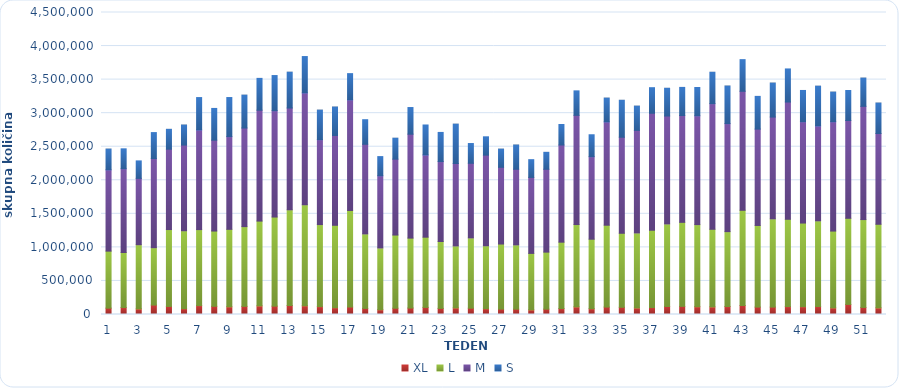
| Category | XL | L | M | S |
|---|---|---|---|---|
| 0 | 94498 | 849678 | 1211338 | 309528 |
| 1 | 103818 | 820427 | 1247774 | 296675 |
| 2 | 83492 | 956067 | 988707 | 260544 |
| 3 | 140397 | 855020 | 1328131 | 387200 |
| 4 | 120017 | 1145674 | 1197704 | 295847 |
| 5 | 87150 | 1160409 | 1276869 | 298854 |
| 6 | 132962 | 1131885 | 1485247 | 482327 |
| 7 | 121484 | 1122017 | 1353790 | 473146 |
| 8 | 114887 | 1154197 | 1381401 | 582470 |
| 9 | 120963 | 1188144 | 1469323 | 490367 |
| 10 | 128666 | 1263235 | 1652187 | 474093 |
| 11 | 124166 | 1328130 | 1584402 | 523873 |
| 12 | 134359 | 1425244 | 1516901 | 534403 |
| 13 | 129889 | 1504830 | 1667198 | 541641 |
| 14 | 117575 | 1222252 | 1265133 | 440721 |
| 15 | 101484 | 1227779 | 1338692 | 423594 |
| 16 | 111031 | 1439070 | 1648310 | 390646 |
| 17 | 90966 | 1109527 | 1336004 | 366061 |
| 18 | 71180 | 920005 | 1076216 | 285326 |
| 19 | 93447 | 1090432 | 1130594 | 312528 |
| 20 | 96065 | 1042082 | 1548541 | 397261 |
| 21 | 105811 | 1046149 | 1225162 | 446762 |
| 22 | 90800 | 996980 | 1190974 | 434161 |
| 23 | 98736 | 922563 | 1228394 | 586894 |
| 24 | 93793 | 1047279 | 1112355 | 294161 |
| 25 | 86603 | 937263 | 1350661 | 273278 |
| 26 | 80118 | 969922 | 1143302 | 271268 |
| 27 | 79741 | 957360 | 1126992 | 361473 |
| 28 | 69391 | 841086 | 1132247 | 264313 |
| 29 | 79714 | 849701 | 1234602 | 252455 |
| 30 | 88506 | 989214 | 1447853 | 305524 |
| 31 | 113714 | 1226473 | 1627406 | 364729 |
| 32 | 86299 | 1035432 | 1229752 | 326867 |
| 33 | 110510 | 1219963 | 1539731 | 354617 |
| 34 | 107255 | 1103122 | 1430921 | 550907 |
| 35 | 98131 | 1116793 | 1528719 | 361544 |
| 36 | 103676 | 1152040 | 1743006 | 380975 |
| 37 | 119281 | 1229934 | 1608213 | 413668 |
| 38 | 121247 | 1252097 | 1592237 | 418168 |
| 39 | 115794 | 1223281 | 1621860 | 421573 |
| 40 | 113645 | 1156101 | 1872287 | 467622 |
| 41 | 118357 | 1116129 | 1609538 | 560507 |
| 42 | 134120 | 1418611 | 1773498 | 471325 |
| 43 | 110152 | 1216459 | 1435732 | 487616 |
| 44 | 110260 | 1314659 | 1517001 | 506908 |
| 45 | 118088 | 1300698 | 1747054 | 493267 |
| 46 | 116841 | 1245721 | 1509818 | 465926 |
| 47 | 118685 | 1276722 | 1414091 | 593016 |
| 48 | 99256 | 1143848 | 1629130 | 442028 |
| 49 | 149971 | 1283563 | 1457493 | 446754 |
| 50 | 105352 | 1308802 | 1687543 | 421385 |
| 51 | 98789 | 1245712 | 1352854 | 453577 |